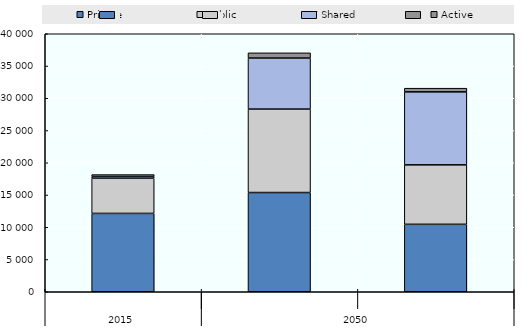
| Category | Private | Public | Shared | Active |
|---|---|---|---|---|
| 0 | 12148.208 | 5446.252 | 266.97 | 302.481 |
| 1 | 15383.359 | 12938.57 | 7913.203 | 805.058 |
| 2 | 10456.893 | 9219.098 | 11317.139 | 567.034 |